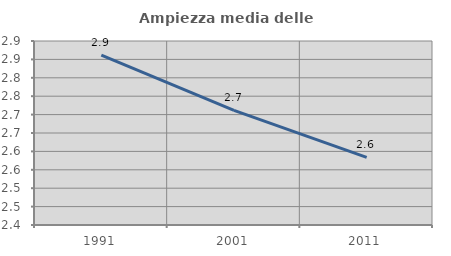
| Category | Ampiezza media delle famiglie |
|---|---|
| 1991.0 | 2.862 |
| 2001.0 | 2.711 |
| 2011.0 | 2.584 |